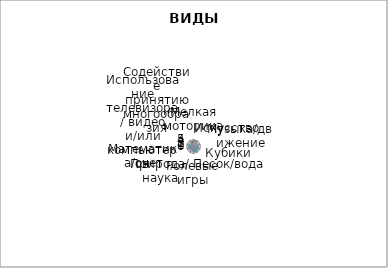
| Category | Series 0 | Series 1 | Series 2 | Series 3 | Series 4 | Series 5 | Series 6 |
|---|---|---|---|---|---|---|---|
| Мелкая моторика | 3 | 5 | 3 | 5 | 4 |  | 4 |
| Искусство | 3 | 4 | 3 | 3 | 4 |  | 3.4 |
| Музыка/движение | 2 | 2 | 2 | 3 | 3 |  | 2.4 |
| Кубики | 1 | 1 | 1 | 3 | 4 |  | 2 |
| Песок/вода | 2 | 1 | 1 | 1 | 4 |  | 1.8 |
| Ролевые игры | 3 | 3 | 2 | 3 | 4 |  | 3 |
| Природа/ наука | 1 | 1 | 1 | 3 | 2 |  | 1.6 |
| Математика/счет | 3 | 4 | 4 | 4 | 4 |  | 3.8 |
| Использование телевизора/ видео и/или компьютеров | 0 | 0 | 0 | 0 | 4 |  | 0.8 |
| Содействие принятию многообразия | 1 | 3 | 1 | 1 | 2 |  | 1.6 |